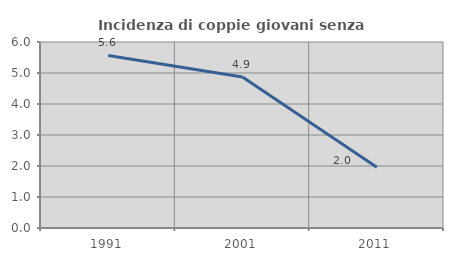
| Category | Incidenza di coppie giovani senza figli |
|---|---|
| 1991.0 | 5.565 |
| 2001.0 | 4.874 |
| 2011.0 | 1.958 |